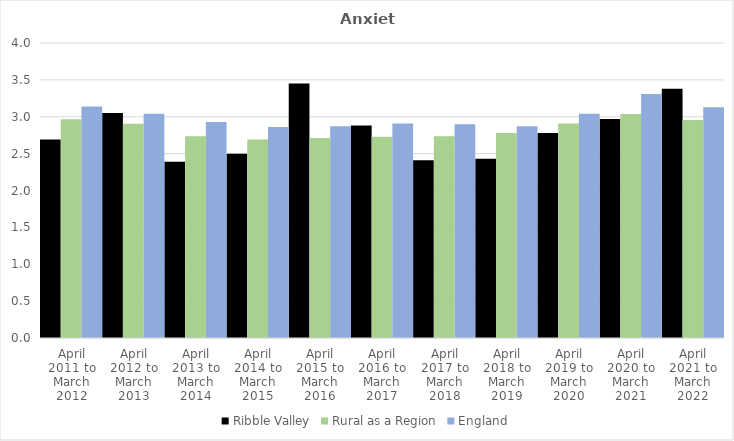
| Category | Ribble Valley | Rural as a Region | England |
|---|---|---|---|
| April 2011 to March 2012 | 2.69 | 2.967 | 3.14 |
| April 2012 to March 2013 | 3.05 | 2.904 | 3.04 |
| April 2013 to March 2014 | 2.39 | 2.734 | 2.93 |
| April 2014 to March 2015 | 2.5 | 2.691 | 2.86 |
| April 2015 to March 2016 | 3.45 | 2.711 | 2.87 |
| April 2016 to March 2017 | 2.88 | 2.729 | 2.91 |
| April 2017 to March 2018 | 2.41 | 2.736 | 2.9 |
| April 2018 to March 2019 | 2.43 | 2.78 | 2.87 |
| April 2019 to March 2020 | 2.78 | 2.908 | 3.04 |
| April 2020 to March 2021 | 2.97 | 3.036 | 3.31 |
| April 2021 to March 2022 | 3.38 | 2.956 | 3.13 |